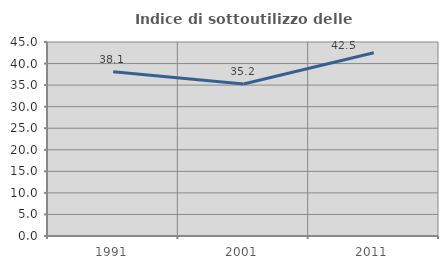
| Category | Indice di sottoutilizzo delle abitazioni  |
|---|---|
| 1991.0 | 38.095 |
| 2001.0 | 35.246 |
| 2011.0 | 42.52 |